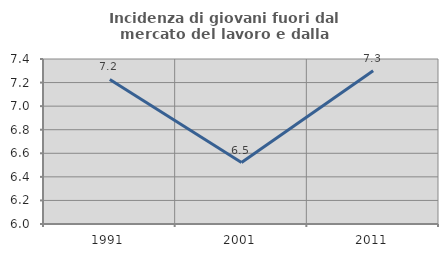
| Category | Incidenza di giovani fuori dal mercato del lavoro e dalla formazione  |
|---|---|
| 1991.0 | 7.227 |
| 2001.0 | 6.522 |
| 2011.0 | 7.301 |